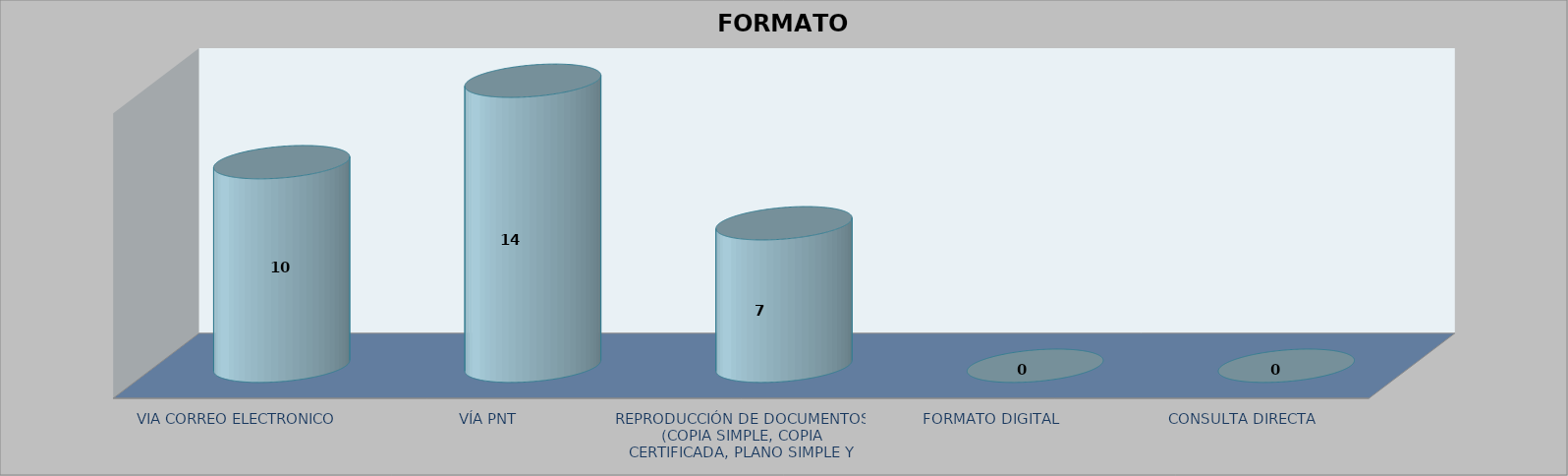
| Category |        FORMATO SOLICITADO | Series 1 | Series 2 |
|---|---|---|---|
| VIA CORREO ELECTRONICO |  |  | 10 |
| VÍA PNT |  |  | 14 |
| REPRODUCCIÓN DE DOCUMENTOS (COPIA SIMPLE, COPIA CERTIFICADA, PLANO SIMPLE Y PLANO CERTIFICADO) |  |  | 7 |
| FORMATO DIGITAL |  |  | 0 |
| CONSULTA DIRECTA |  |  | 0 |